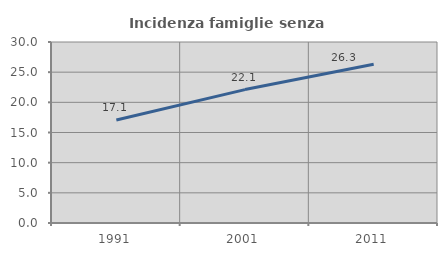
| Category | Incidenza famiglie senza nuclei |
|---|---|
| 1991.0 | 17.073 |
| 2001.0 | 22.111 |
| 2011.0 | 26.298 |